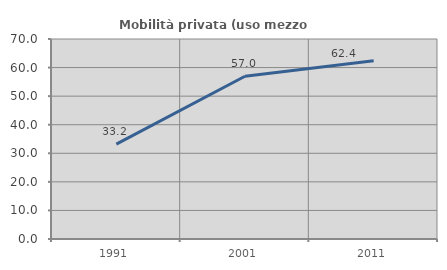
| Category | Mobilità privata (uso mezzo privato) |
|---|---|
| 1991.0 | 33.193 |
| 2001.0 | 56.957 |
| 2011.0 | 62.415 |